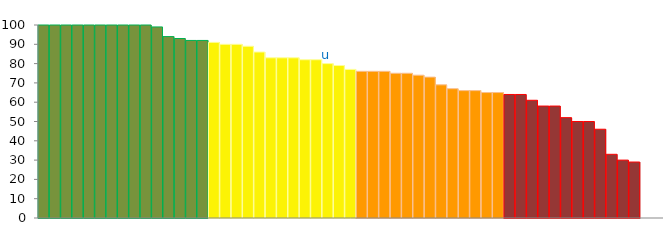
| Category | Top Quartile | 2nd Quartile | 3rd Quartile | Bottom Quartile | Series 4 |
|---|---|---|---|---|---|
|  | 100 | 0 | 0 | 0 | 100 |
|  | 100 | 0 | 0 | 0 | 100 |
|  | 100 | 0 | 0 | 0 | 100 |
|  | 100 | 0 | 0 | 0 | 100 |
|  | 100 | 0 | 0 | 0 | 100 |
|  | 100 | 0 | 0 | 0 | 100 |
|  | 100 | 0 | 0 | 0 | 100 |
|  | 100 | 0 | 0 | 0 | 100 |
|  | 100 | 0 | 0 | 0 | 100 |
|  | 100 | 0 | 0 | 0 | 100 |
|  | 99 | 0 | 0 | 0 | 99 |
|  | 94 | 0 | 0 | 0 | 94 |
|  | 93 | 0 | 0 | 0 | 93 |
|  | 92 | 0 | 0 | 0 | 92 |
|  | 92 | 0 | 0 | 0 | 92 |
|  | 0 | 91 | 0 | 0 | 91 |
|  | 0 | 90 | 0 | 0 | 90 |
|  | 0 | 90 | 0 | 0 | 90 |
|  | 0 | 89 | 0 | 0 | 89 |
|  | 0 | 86 | 0 | 0 | 86 |
|  | 0 | 83 | 0 | 0 | 83 |
|  | 0 | 83 | 0 | 0 | 83 |
|  | 0 | 83 | 0 | 0 | 83 |
|  | 0 | 82 | 0 | 0 | 82 |
|  | 0 | 82 | 0 | 0 | 82 |
| u | 0 | 80 | 0 | 0 | 80 |